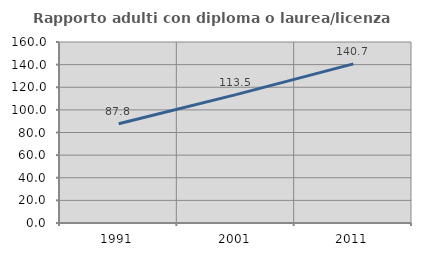
| Category | Rapporto adulti con diploma o laurea/licenza media  |
|---|---|
| 1991.0 | 87.801 |
| 2001.0 | 113.486 |
| 2011.0 | 140.704 |